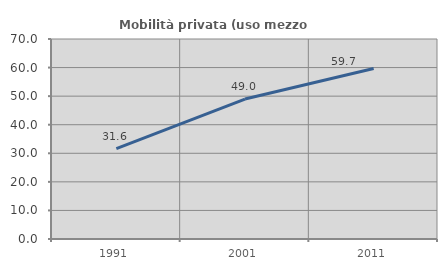
| Category | Mobilità privata (uso mezzo privato) |
|---|---|
| 1991.0 | 31.63 |
| 2001.0 | 48.972 |
| 2011.0 | 59.689 |